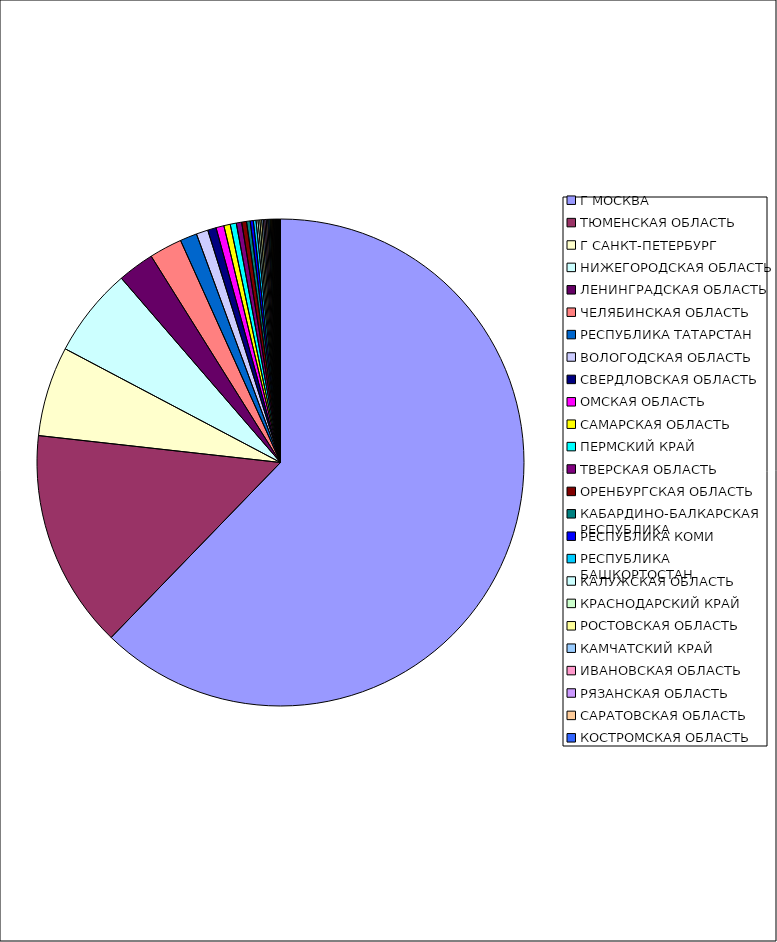
| Category | Оборот |
|---|---|
| Г МОСКВА | 0.622 |
| ТЮМЕНСКАЯ ОБЛАСТЬ | 0.145 |
| Г САНКТ-ПЕТЕРБУРГ | 0.06 |
| НИЖЕГОРОДСКАЯ ОБЛАСТЬ | 0.059 |
| ЛЕНИНГРАДСКАЯ ОБЛАСТЬ | 0.024 |
| ЧЕЛЯБИНСКАЯ ОБЛАСТЬ | 0.022 |
| РЕСПУБЛИКА ТАТАРСТАН | 0.011 |
| ВОЛОГОДСКАЯ ОБЛАСТЬ | 0.008 |
| СВЕРДЛОВСКАЯ ОБЛАСТЬ | 0.006 |
| ОМСКАЯ ОБЛАСТЬ | 0.005 |
| САМАРСКАЯ ОБЛАСТЬ | 0.004 |
| ПЕРМСКИЙ КРАЙ | 0.004 |
| ТВЕРСКАЯ ОБЛАСТЬ | 0.004 |
| ОРЕНБУРГСКАЯ ОБЛАСТЬ | 0.003 |
| КАБАРДИНО-БАЛКАРСКАЯ РЕСПУБЛИКА | 0.002 |
| РЕСПУБЛИКА КОМИ | 0.002 |
| РЕСПУБЛИКА БАШКОРТОСТАН | 0.002 |
| КАЛУЖСКАЯ ОБЛАСТЬ | 0.001 |
| КРАСНОДАРСКИЙ КРАЙ | 0.001 |
| РОСТОВСКАЯ ОБЛАСТЬ | 0.001 |
| КАМЧАТСКИЙ КРАЙ | 0.001 |
| ИВАНОВСКАЯ ОБЛАСТЬ | 0.001 |
| РЯЗАНСКАЯ ОБЛАСТЬ | 0.001 |
| САРАТОВСКАЯ ОБЛАСТЬ | 0.001 |
| КОСТРОМСКАЯ ОБЛАСТЬ | 0.001 |
| РЕСПУБЛИКА ДАГЕСТАН | 0.001 |
| СМОЛЕНСКАЯ ОБЛАСТЬ | 0.001 |
| КУРСКАЯ ОБЛАСТЬ | 0.001 |
| ИРКУТСКАЯ ОБЛАСТЬ | 0.001 |
| ПСКОВСКАЯ ОБЛАСТЬ | 0.001 |
| УЛЬЯНОВСКАЯ ОБЛАСТЬ | 0.001 |
| КИРОВСКАЯ ОБЛАСТЬ | 0 |
| ПРИМОРСКИЙ КРАЙ | 0 |
| УДМУРТСКАЯ РЕСПУБЛИКА | 0 |
| ЛИПЕЦКАЯ ОБЛАСТЬ | 0 |
| НОВОСИБИРСКАЯ ОБЛАСТЬ | 0 |
| СТАВРОПОЛЬСКИЙ КРАЙ | 0 |
| РЕСПУБЛИКА СЕВЕРНАЯ ОСЕТИЯ-АЛАНИЯ | 0 |
| ТУЛЬСКАЯ ОБЛАСТЬ | 0 |
| АЛТАЙСКИЙ КРАЙ | 0 |
| БЕЛГОРОДСКАЯ ОБЛАСТЬ | 0 |
| РЕСПУБЛИКА МОРДОВИЯ | 0 |
| КРАСНОЯРСКИЙ КРАЙ | 0 |
| ЧУВАШСКАЯ РЕСПУБЛИКА | 0 |
| КЕМЕРОВСКАЯ ОБЛАСТЬ | 0 |
| ВЛАДИМИРСКАЯ ОБЛАСТЬ | 0 |